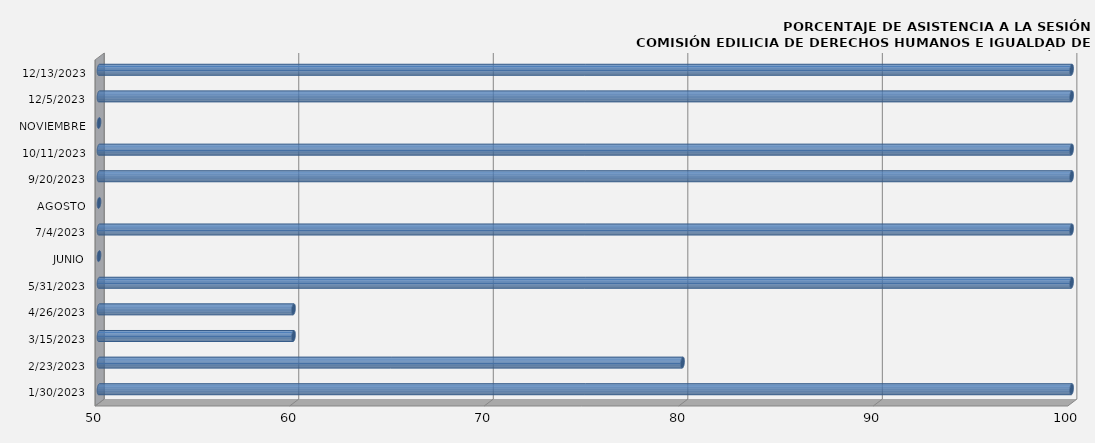
| Category | 1/30/2023 |
|---|---|
| 1/30/2023 | 100 |
| 2/23/2023 | 80 |
| 3/15/2023 | 60 |
| 4/26/2023 | 60 |
| 5/31/2023 | 100 |
| JUNIO | 0 |
| 7/4/2023 | 100 |
| AGOSTO | 0 |
| 9/20/2023 | 100 |
| 10/11/2023 | 100 |
| NOVIEMBRE | 0 |
| 12/5/2023 | 100 |
| 12/13/2023 | 100 |